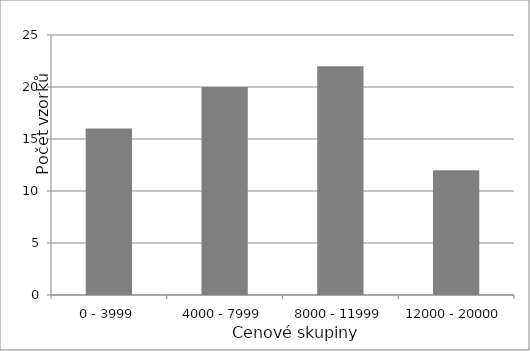
| Category | Cenové skupiny |
|---|---|
| 0 - 3999 | 16 |
| 4000 - 7999 | 20 |
| 8000 - 11999 | 22 |
| 12000 - 20000 | 12 |